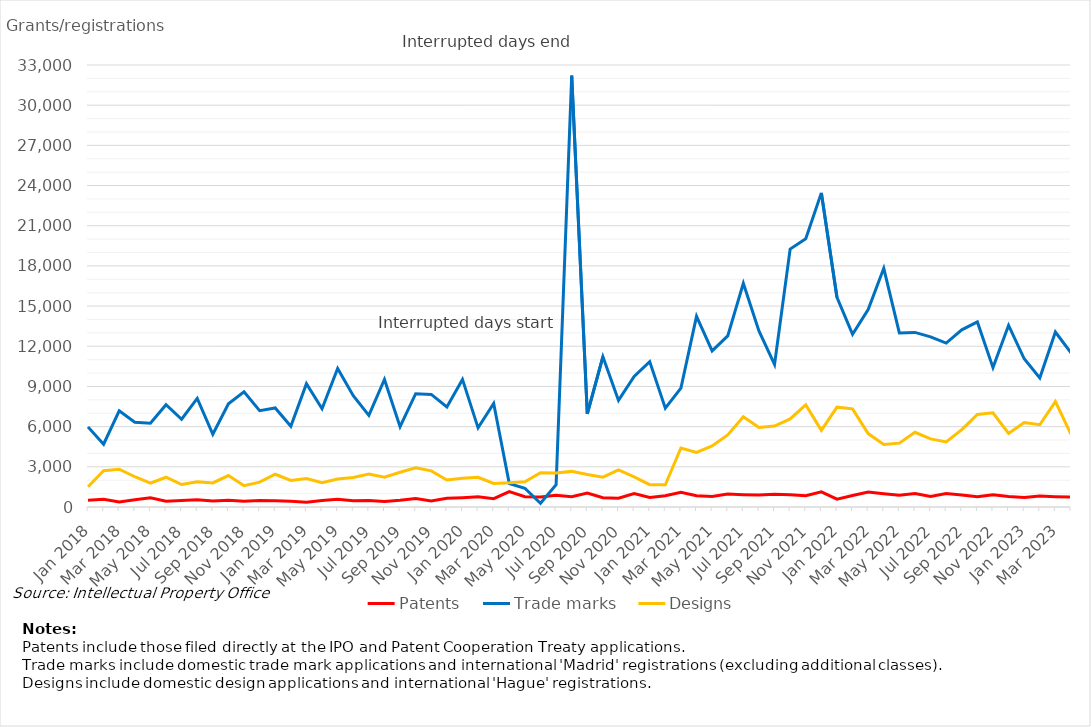
| Category | Patents | Trade marks | Designs |
|---|---|---|---|
| Jan 2018 | 495 | 5979 | 1512 |
| Feb 2018 | 574 | 4687 | 2704 |
| Mar 2018 | 370 | 7179 | 2825 |
| Apr 2018 | 543 | 6334 | 2259 |
| May 2018 | 690 | 6253 | 1789 |
| Jun 2018 | 424 | 7637 | 2222 |
| Jul 2018 | 486 | 6552 | 1678 |
| Aug 2018 | 536 | 8104 | 1878 |
| Sep 2018 | 450 | 5430 | 1795 |
| Oct 2018 | 498 | 7701 | 2348 |
| Nov 2018 | 432 | 8603 | 1592 |
| Dec 2018 | 484 | 7194 | 1859 |
| Jan 2019 | 474 | 7394 | 2444 |
| Feb 2019 | 426 | 6023 | 1987 |
| Mar 2019 | 363 | 9208 | 2125 |
| Apr 2019 | 488 | 7337 | 1810 |
| May 2019 | 573 | 10347 | 2096 |
| Jun 2019 | 471 | 8305 | 2202 |
| Jul 2019 | 489 | 6840 | 2464 |
| Aug 2019 | 420 | 9519 | 2218 |
| Sep 2019 | 500 | 5992 | 2596 |
| Oct 2019 | 634 | 8460 | 2926 |
| Nov 2019 | 455 | 8403 | 2700 |
| Dec 2019 | 654 | 7466 | 2021 |
| Jan 2020 | 696 | 9527 | 2145 |
| Feb 2020 | 756 | 5909 | 2219 |
| Mar 2020 | 622 | 7723 | 1757 |
| Apr 2020 | 1143 | 1743 | 1803 |
| May 2020 | 768 | 1399 | 1888 |
| Jun 2020 | 740 | 282 | 2564 |
| Jul 2020 | 878 | 1660 | 2539 |
| Aug 2020 | 771 | 32204 | 2659 |
| Sep 2020 | 1042 | 6950 | 2425 |
| Oct 2020 | 697 | 11225 | 2223 |
| Nov 2020 | 649 | 7956 | 2763 |
| Dec 2020 | 1010 | 9752 | 2252 |
| Jan 2021 | 708 | 10856 | 1665 |
| Feb 2021 | 838 | 7381 | 1660 |
| Mar 2021 | 1107 | 8878 | 4408 |
| Apr 2021 | 838 | 14233 | 4074 |
| May 2021 | 788 | 11655 | 4562 |
| Jun 2021 | 972 | 12773 | 5385 |
| Jul 2021 | 918 | 16695 | 6731 |
| Aug 2021 | 887 | 13149 | 5944 |
| Sep 2021 | 947 | 10648 | 6041 |
| Oct 2021 | 920 | 19255 | 6577 |
| Nov 2021 | 841 | 20030 | 7629 |
| Dec 2021 | 1131 | 23452 | 5719 |
| Jan 2022 | 585 | 15660 | 7455 |
| Feb 2022 | 860 | 12898 | 7329 |
| Mar 2022 | 1111 | 14744 | 5482 |
| Apr 2022 | 990 | 17821 | 4662 |
| May 2022 | 883 | 12995 | 4767 |
| Jun 2022 | 1010 | 13035 | 5577 |
| Jul 2022 | 788 | 12701 | 5082 |
| Aug 2022 | 1007 | 12236 | 4856 |
| Sep 2022 | 889 | 13227 | 5776 |
| Oct 2022 | 758 | 13818 | 6904 |
| Nov 2022 | 920 | 10405 | 7027 |
| Dec 2022 | 777 | 13566 | 5498 |
| Jan 2023 | 708 | 11067 | 6304 |
| Feb 2023 | 817 | 9627 | 6141 |
| Mar 2023 | 770 | 13064 | 7872 |
| Apr 2023 | 747 | 11512 | 5420 |